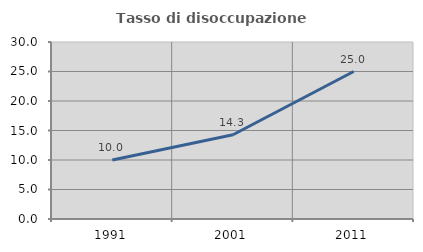
| Category | Tasso di disoccupazione giovanile  |
|---|---|
| 1991.0 | 10 |
| 2001.0 | 14.286 |
| 2011.0 | 25 |